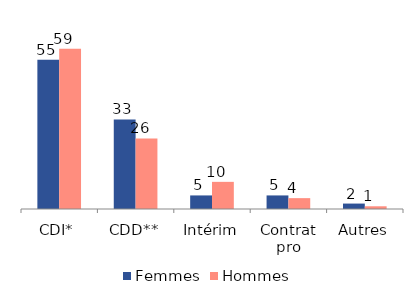
| Category | Femmes | Hommes |
|---|---|---|
| CDI* | 55 | 59 |
| CDD** | 33 | 26 |
| Intérim | 5 | 10 |
| Contrat
pro | 5 | 4 |
| Autres | 2 | 1 |